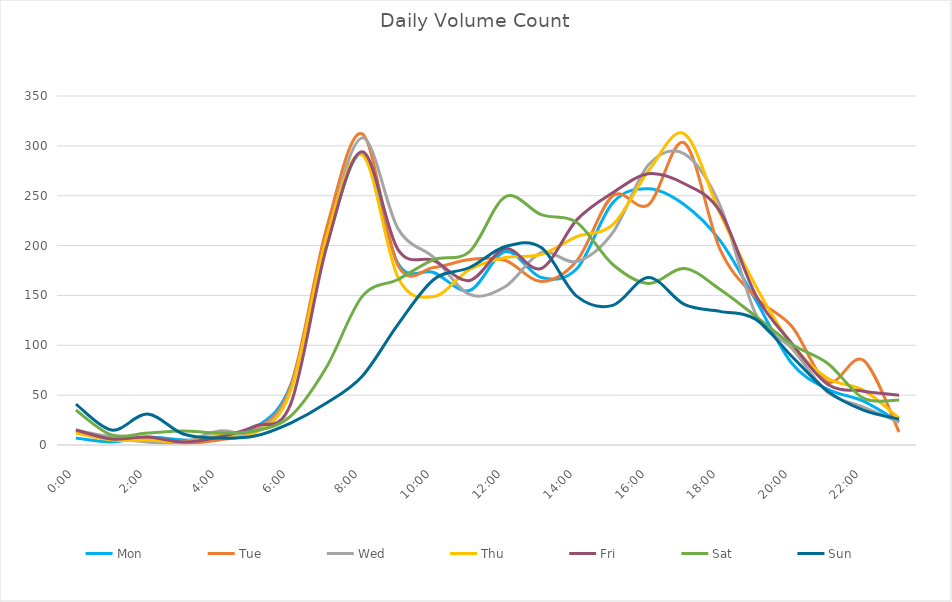
| Category | Mon | Tue | Wed | Thu | Fri | Sat | Sun |
|---|---|---|---|---|---|---|---|
| 0.0 | 7 | 13 | 15 | 12 | 15 | 35 | 41 |
| 0.0416666666666667 | 3 | 8 | 8 | 5 | 6 | 10 | 15 |
| 0.0833333333333333 | 8 | 6 | 3 | 5 | 8 | 12 | 31 |
| 0.125 | 5 | 2 | 3 | 3 | 3 | 14 | 11 |
| 0.166666666666667 | 6 | 5 | 14 | 10 | 8 | 12 | 7 |
| 0.208333333333333 | 17 | 15 | 14 | 12 | 19 | 14 | 9 |
| 0.25 | 60 | 59 | 56 | 54 | 41 | 29 | 22 |
| 0.291666666666667 | 200 | 217 | 207 | 208 | 198 | 78 | 42 |
| 0.333333333333333 | 292 | 312 | 308 | 291 | 294 | 149 | 69 |
| 0.375 | 182 | 180 | 217 | 168 | 196 | 166 | 121 |
| 0.416666666666667 | 173 | 178 | 188 | 149 | 185 | 186 | 166 |
| 0.4583333333333333 | 155 | 186 | 151 | 176 | 165 | 194 | 178 |
| 0.5 | 194 | 185 | 159 | 188 | 197 | 249 | 199 |
| 0.541666666666667 | 168 | 164 | 193 | 191 | 177 | 231 | 198 |
| 0.5833333333333334 | 177 | 185 | 184 | 209 | 226 | 223 | 149 |
| 0.625 | 243 | 250 | 213 | 221 | 253 | 181 | 140 |
| 0.666666666666667 | 257 | 241 | 281 | 275 | 272 | 162 | 168 |
| 0.7083333333333334 | 241 | 303 | 292 | 312 | 262 | 177 | 141 |
| 0.75 | 205 | 196 | 240 | 232 | 234 | 156 | 134 |
| 0.791666666666667 | 145 | 148 | 131 | 159 | 150 | 129 | 126 |
| 0.8333333333333334 | 82 | 119 | 97 | 101 | 102 | 101 | 89 |
| 0.875 | 56 | 63 | 53 | 67 | 61 | 82 | 54 |
| 0.916666666666667 | 44 | 85 | 38 | 55 | 54 | 47 | 35 |
| 0.9583333333333334 | 23 | 13 | 23 | 27 | 50 | 45 | 26 |